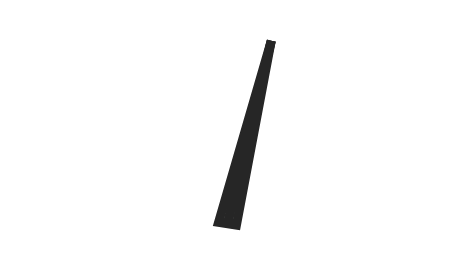
| Category | y |
|---|---|
| 59.62257909854148 | 49.065 |
| 51.96261294054322 | -0.385 |
| 48.03738705945678 | 0.385 |
| 59.62257909854148 | 49.065 |
| 50.0 | 0 |